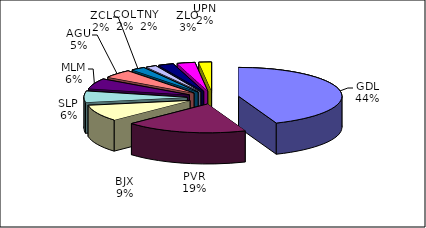
| Category | Series 0 |
|---|---|
| GDL | 134824 |
| PVR | 58418 |
| BJX | 28100 |
| SLP | 19075 |
| MLM | 17621 |
| AGU | 14371 |
| ZCL | 6739 |
| COL | 5001 |
| TNY | 7282 |
| ZLO | 8592 |
| UPN | 6056 |